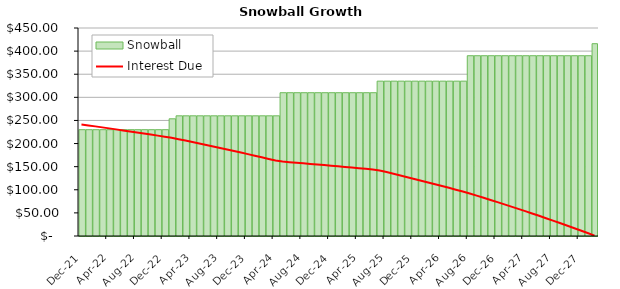
| Category | Snowball |
|---|---|
| 2021-12-01 | 230 |
| 2022-01-01 | 230 |
| 2022-02-01 | 230 |
| 2022-03-01 | 230 |
| 2022-04-01 | 230 |
| 2022-05-01 | 230 |
| 2022-06-01 | 230 |
| 2022-07-01 | 230 |
| 2022-08-01 | 230 |
| 2022-09-01 | 230 |
| 2022-10-01 | 230 |
| 2022-11-01 | 230 |
| 2022-12-01 | 230 |
| 2023-01-01 | 253.55 |
| 2023-02-01 | 260 |
| 2023-03-01 | 260 |
| 2023-04-01 | 260 |
| 2023-05-01 | 260 |
| 2023-06-01 | 260 |
| 2023-07-01 | 260 |
| 2023-08-01 | 260 |
| 2023-09-01 | 260 |
| 2023-10-01 | 260 |
| 2023-11-01 | 260 |
| 2023-12-01 | 260 |
| 2024-01-01 | 260 |
| 2024-02-01 | 260 |
| 2024-03-01 | 260 |
| 2024-04-01 | 260 |
| 2024-05-01 | 310 |
| 2024-06-01 | 310 |
| 2024-07-01 | 310 |
| 2024-08-01 | 310 |
| 2024-09-01 | 310 |
| 2024-10-01 | 310 |
| 2024-11-01 | 310 |
| 2024-12-01 | 310 |
| 2025-01-01 | 310 |
| 2025-02-01 | 310 |
| 2025-03-01 | 310 |
| 2025-04-01 | 310 |
| 2025-05-01 | 310 |
| 2025-06-01 | 310 |
| 2025-07-01 | 335 |
| 2025-08-01 | 335 |
| 2025-09-01 | 335 |
| 2025-10-01 | 335 |
| 2025-11-01 | 335 |
| 2025-12-01 | 335 |
| 2026-01-01 | 335 |
| 2026-02-01 | 335 |
| 2026-03-01 | 335 |
| 2026-04-01 | 335 |
| 2026-05-01 | 335 |
| 2026-06-01 | 335 |
| 2026-07-01 | 335 |
| 2026-08-01 | 390 |
| 2026-09-01 | 390 |
| 2026-10-01 | 390 |
| 2026-11-01 | 390 |
| 2026-12-01 | 390 |
| 2027-01-01 | 390 |
| 2027-02-01 | 390 |
| 2027-03-01 | 390 |
| 2027-04-01 | 390 |
| 2027-05-01 | 390 |
| 2027-06-01 | 390 |
| 2027-07-01 | 390 |
| 2027-08-01 | 390 |
| 2027-09-01 | 390 |
| 2027-10-01 | 390 |
| 2027-11-01 | 390 |
| 2027-12-01 | 390 |
| 2028-01-01 | 390 |
| 2028-02-01 | 416.05 |
| #N/A | 0 |
| #N/A | 0 |
| #N/A | 0 |
| #N/A | 0 |
| #N/A | 0 |
| #N/A | 0 |
| #N/A | 0 |
| #N/A | 0 |
| #N/A | 0 |
| #N/A | 0 |
| #N/A | 0 |
| #N/A | 0 |
| #N/A | 0 |
| #N/A | 0 |
| #N/A | 0 |
| #N/A | 0 |
| #N/A | 0 |
| #N/A | 0 |
| #N/A | 0 |
| #N/A | 0 |
| #N/A | 0 |
| #N/A | 0 |
| #N/A | 0 |
| #N/A | 0 |
| #N/A | 0 |
| #N/A | 0 |
| #N/A | 0 |
| #N/A | 0 |
| #N/A | 0 |
| #N/A | 0 |
| #N/A | 0 |
| #N/A | 0 |
| #N/A | 0 |
| #N/A | 0 |
| #N/A | 0 |
| #N/A | 0 |
| #N/A | 0 |
| #N/A | 0 |
| #N/A | 0 |
| #N/A | 0 |
| #N/A | 0 |
| #N/A | 0 |
| #N/A | 0 |
| #N/A | 0 |
| #N/A | 0 |
| #N/A | 0 |
| #N/A | 0 |
| #N/A | 0 |
| #N/A | 0 |
| #N/A | 0 |
| #N/A | 0 |
| #N/A | 0 |
| #N/A | 0 |
| #N/A | 0 |
| #N/A | 0 |
| #N/A | 0 |
| #N/A | 0 |
| #N/A | 0 |
| #N/A | 0 |
| #N/A | 0 |
| #N/A | 0 |
| #N/A | 0 |
| #N/A | 0 |
| #N/A | 0 |
| #N/A | 0 |
| #N/A | 0 |
| #N/A | 0 |
| #N/A | 0 |
| #N/A | 0 |
| #N/A | 0 |
| #N/A | 0 |
| #N/A | 0 |
| #N/A | 0 |
| #N/A | 0 |
| #N/A | 0 |
| #N/A | 0 |
| #N/A | 0 |
| #N/A | 0 |
| #N/A | 0 |
| #N/A | 0 |
| #N/A | 0 |
| #N/A | 0 |
| #N/A | 0 |
| #N/A | 0 |
| #N/A | 0 |
| #N/A | 0 |
| #N/A | 0 |
| #N/A | 0 |
| #N/A | 0 |
| #N/A | 0 |
| #N/A | 0 |
| #N/A | 0 |
| #N/A | 0 |
| #N/A | 0 |
| #N/A | 0 |
| #N/A | 0 |
| #N/A | 0 |
| #N/A | 0 |
| #N/A | 0 |
| #N/A | 0 |
| #N/A | 0 |
| #N/A | 0 |
| #N/A | 0 |
| #N/A | 0 |
| #N/A | 0 |
| #N/A | 0 |
| #N/A | 0 |
| #N/A | 0 |
| #N/A | 0 |
| #N/A | 0 |
| #N/A | 0 |
| #N/A | 0 |
| #N/A | 0 |
| #N/A | 0 |
| #N/A | 0 |
| #N/A | 0 |
| #N/A | 0 |
| #N/A | 0 |
| #N/A | 0 |
| #N/A | 0 |
| #N/A | 0 |
| #N/A | 0 |
| #N/A | 0 |
| #N/A | 0 |
| #N/A | 0 |
| #N/A | 0 |
| #N/A | 0 |
| #N/A | 0 |
| #N/A | 0 |
| #N/A | 0 |
| #N/A | 0 |
| #N/A | 0 |
| #N/A | 0 |
| #N/A | 0 |
| #N/A | 0 |
| #N/A | 0 |
| #N/A | 0 |
| #N/A | 0 |
| #N/A | 0 |
| #N/A | 0 |
| #N/A | 0 |
| #N/A | 0 |
| #N/A | 0 |
| #N/A | 0 |
| #N/A | 0 |
| #N/A | 0 |
| #N/A | 0 |
| #N/A | 0 |
| #N/A | 0 |
| #N/A | 0 |
| #N/A | 0 |
| #N/A | 0 |
| #N/A | 0 |
| #N/A | 0 |
| #N/A | 0 |
| #N/A | 0 |
| #N/A | 0 |
| #N/A | 0 |
| #N/A | 0 |
| #N/A | 0 |
| #N/A | 0 |
| #N/A | 0 |
| #N/A | 0 |
| #N/A | 0 |
| #N/A | 0 |
| #N/A | 0 |
| #N/A | 0 |
| #N/A | 0 |
| #N/A | 0 |
| #N/A | 0 |
| #N/A | 0 |
| #N/A | 0 |
| #N/A | 0 |
| #N/A | 0 |
| #N/A | 0 |
| #N/A | 0 |
| #N/A | 0 |
| #N/A | 0 |
| #N/A | 0 |
| #N/A | 0 |
| #N/A | 0 |
| #N/A | 0 |
| #N/A | 0 |
| #N/A | 0 |
| #N/A | 0 |
| #N/A | 0 |
| #N/A | 0 |
| #N/A | 0 |
| #N/A | 0 |
| #N/A | 0 |
| #N/A | 0 |
| #N/A | 0 |
| #N/A | 0 |
| #N/A | 0 |
| #N/A | 0 |
| #N/A | 0 |
| #N/A | 0 |
| #N/A | 0 |
| #N/A | 0 |
| #N/A | 0 |
| #N/A | 0 |
| #N/A | 0 |
| #N/A | 0 |
| #N/A | 0 |
| #N/A | 0 |
| #N/A | 0 |
| #N/A | 0 |
| #N/A | 0 |
| #N/A | 0 |
| #N/A | 0 |
| #N/A | 0 |
| #N/A | 0 |
| #N/A | 0 |
| #N/A | 0 |
| #N/A | 0 |
| #N/A | 0 |
| #N/A | 0 |
| #N/A | 0 |
| #N/A | 0 |
| #N/A | 0 |
| #N/A | 0 |
| #N/A | 0 |
| #N/A | 0 |
| #N/A | 0 |
| #N/A | 0 |
| #N/A | 0 |
| #N/A | 0 |
| #N/A | 0 |
| #N/A | 0 |
| #N/A | 0 |
| #N/A | 0 |
| #N/A | 0 |
| #N/A | 0 |
| #N/A | 0 |
| #N/A | 0 |
| #N/A | 0 |
| #N/A | 0 |
| #N/A | 0 |
| #N/A | 0 |
| #N/A | 0 |
| #N/A | 0 |
| #N/A | 0 |
| #N/A | 0 |
| #N/A | 0 |
| #N/A | 0 |
| #N/A | 0 |
| #N/A | 0 |
| #N/A | 0 |
| #N/A | 0 |
| #N/A | 0 |
| #N/A | 0 |
| #N/A | 0 |
| #N/A | 0 |
| #N/A | 0 |
| #N/A | 0 |
| #N/A | 0 |
| #N/A | 0 |
| #N/A | 0 |
| #N/A | 0 |
| #N/A | 0 |
| #N/A | 0 |
| #N/A | 0 |
| #N/A | 0 |
| #N/A | 0 |
| #N/A | 0 |
| #N/A | 0 |
| #N/A | 0 |
| #N/A | 0 |
| #N/A | 0 |
| #N/A | 0 |
| #N/A | 0 |
| #N/A | 0 |
| #N/A | 0 |
| #N/A | 0 |
| #N/A | 0 |
| #N/A | 0 |
| #N/A | 0 |
| #N/A | 0 |
| #N/A | 0 |
| #N/A | 0 |
| #N/A | 0 |
| #N/A | 0 |
| #N/A | 0 |
| #N/A | 0 |
| #N/A | 0 |